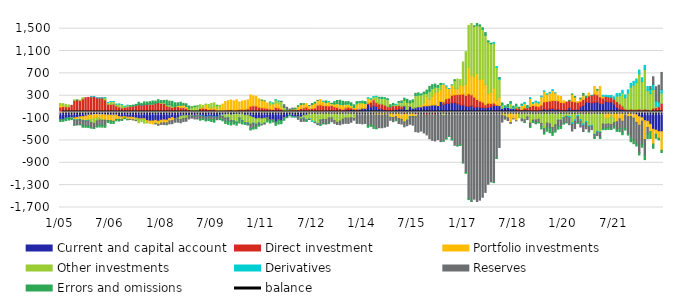
| Category | Current and capital account | Direct investment | Portfolio investments | Other investments | Derivatives | Reserves | Errors and omissions |
|---|---|---|---|---|---|---|---|
| 2005-01-01 | -124.441 | 95.969 | 39.087 | 26.806 | -3.065 | -5.26 | -29.096 |
| 2005-02-01 | -122.296 | 106.451 | 15.114 | 35.964 | -2.865 | -3.918 | -28.449 |
| 2005-03-01 | -100.116 | 102.116 | 6.391 | 36.628 | -2.888 | -3.167 | -38.963 |
| 2005-04-01 | -90.744 | 102.48 | 2.986 | 29.42 | -4.783 | -6.772 | -32.587 |
| 2005-05-01 | -89.679 | 128.07 | -3.823 | -2.079 | -5.604 | -5.721 | -21.164 |
| 2005-06-01 | -96.933 | 213.928 | -31.807 | 14.9 | -7.103 | -88.045 | -4.94 |
| 2005-07-01 | -88.549 | 221.495 | -40.71 | -0.842 | -6.275 | -86.563 | 1.444 |
| 2005-08-01 | -77.137 | 212.773 | -43.483 | 6.714 | -6.537 | -89.944 | -2.386 |
| 2005-09-01 | -73.567 | 242.95 | -64.269 | 20.836 | -5.857 | -90.117 | -29.976 |
| 2005-10-01 | -62.91 | 265.013 | -77.21 | -7.197 | -4.649 | -90.105 | -22.942 |
| 2005-11-01 | -48.904 | 269.98 | -71.257 | -26.77 | -3.361 | -92.488 | -27.198 |
| 2005-12-01 | -44.466 | 279.63 | -81.187 | -52.224 | 0.188 | -92.851 | -9.091 |
| 2006-01-01 | -35.444 | 286.612 | -77.386 | -82.044 | 0.334 | -88.37 | -3.702 |
| 2006-02-01 | -32.147 | 261.427 | -60.913 | -57.207 | 0.355 | -92.35 | -19.166 |
| 2006-03-01 | -36.206 | 259.906 | -66.476 | -31.709 | 0.352 | -90.272 | -35.595 |
| 2006-04-01 | -38.805 | 261.891 | -82.916 | -18.61 | 0.424 | -86.38 | -35.603 |
| 2006-05-01 | -42.031 | 226.242 | -94.803 | 38.443 | 0.405 | -87.108 | -41.149 |
| 2006-06-01 | -44.576 | 146.85 | -99.523 | 30.924 | 0.366 | -5.548 | -28.492 |
| 2006-07-01 | -48.513 | 145.409 | -99.489 | 49.973 | 0.44 | -6.593 | -41.226 |
| 2006-08-01 | -46.557 | 148.445 | -108.886 | 47.854 | 0.452 | -6.15 | -35.158 |
| 2006-09-01 | -45.66 | 119.059 | -76.938 | 29.42 | 0.458 | -5.379 | -20.96 |
| 2006-10-01 | -73.871 | 97.411 | -49.213 | 54.007 | 0.541 | -7.077 | -21.796 |
| 2006-11-01 | -78.121 | 82.298 | -45.066 | 59.653 | 0.578 | -4.684 | -14.658 |
| 2006-12-01 | -75.212 | 90.262 | -26.882 | 20.925 | 0.679 | -2.075 | -7.696 |
| 2007-01-01 | -83.423 | 101.253 | -38.198 | 27.914 | 0.347 | -6.558 | -1.335 |
| 2007-02-01 | -84.812 | 110.884 | -37.352 | 5.205 | 0.448 | -0.928 | 6.556 |
| 2007-03-01 | -87.759 | 119.2 | -42.444 | 2.9 | 0.651 | -2.222 | 9.675 |
| 2007-04-01 | -98.952 | 125.496 | -20.046 | -24.529 | 0.603 | -1.944 | 19.374 |
| 2007-05-01 | -115.181 | 140.267 | -0.424 | -67.889 | 0.571 | 3.145 | 39.512 |
| 2007-06-01 | -111.686 | 132.066 | -13.346 | -38.819 | 0.383 | 5.255 | 26.147 |
| 2007-07-01 | -110.629 | 139.899 | -17.679 | -62.691 | 0.819 | 5.975 | 44.306 |
| 2007-08-01 | -145.936 | 146.494 | -28.978 | -12.535 | 0.999 | 3.072 | 36.885 |
| 2007-09-01 | -153.084 | 142.552 | -41.157 | 10.856 | 1.127 | 2.524 | 37.18 |
| 2007-10-01 | -151.952 | 148.301 | -52.926 | 6.14 | 1.324 | 1.454 | 47.66 |
| 2007-11-01 | -140.913 | 169.558 | -46.7 | -12.052 | 1.439 | -4.989 | 33.657 |
| 2007-12-01 | -155.189 | 179.064 | -58.258 | 4.625 | 1.297 | -15.666 | 44.127 |
| 2008-01-01 | -139.155 | 162.969 | -50.423 | 13.634 | 1.767 | -23.652 | 34.859 |
| 2008-02-01 | -132.842 | 162.76 | -50.101 | 16.257 | 2.075 | -32.474 | 34.324 |
| 2008-03-01 | -137.494 | 118.698 | -47.643 | 19.909 | 1.501 | -34.244 | 79.272 |
| 2008-04-01 | -107.244 | 104.523 | -43.151 | 34.588 | 1.689 | -53.309 | 62.904 |
| 2008-05-01 | -89.527 | 91.732 | -53.819 | 26.557 | 1.924 | -56.774 | 79.906 |
| 2008-06-01 | -112.332 | 113.068 | -1.37 | 0.386 | 3.156 | -60.286 | 57.377 |
| 2008-07-01 | -98.433 | 104.608 | 24.023 | -16.001 | 2.504 | -59.112 | 42.41 |
| 2008-08-01 | -65.04 | 85.821 | 43.933 | -59.607 | 1.553 | -59.348 | 52.687 |
| 2008-09-01 | -58.791 | 87.331 | 47.4 | -47.509 | 1.636 | -56.478 | 26.412 |
| 2008-10-01 | -56.607 | 74.424 | 35.608 | -41.803 | 1.578 | -57.768 | 44.569 |
| 2008-11-01 | -61.103 | 53.223 | -7.622 | 24.032 | -0.127 | -47.052 | 38.648 |
| 2008-12-01 | -49.23 | 36.327 | -9.146 | 58.766 | -2.607 | -40.111 | 6.001 |
| 2009-01-01 | -65.644 | 34.981 | -6.533 | 68.796 | -3.869 | -39.448 | 11.717 |
| 2009-02-01 | -47.079 | 33.476 | -5.426 | 82.017 | -5.137 | -59.391 | 1.54 |
| 2009-03-01 | -57.657 | 76.496 | 2.846 | 59.438 | -4.729 | -56.897 | -19.497 |
| 2009-04-01 | -63.743 | 78.011 | 16.979 | 33.12 | -4.444 | -45.707 | -14.217 |
| 2009-05-01 | -77.985 | 71.53 | 69.517 | 9.818 | -5.037 | -50.088 | -17.755 |
| 2009-06-01 | -65.636 | 52.724 | 37.762 | 54.86 | -5.444 | -45.396 | -28.868 |
| 2009-07-01 | -70.456 | 56.607 | 23.473 | 81.424 | -5.5 | -50.881 | -34.667 |
| 2009-08-01 | -75.834 | 60.436 | 37.65 | 75.148 | -4.999 | -42.508 | -49.894 |
| 2009-09-01 | -80.317 | 19.168 | 53.25 | 56.442 | -5.31 | -43.295 | 0.062 |
| 2009-10-01 | -50.64 | 16.017 | 84.549 | 27.42 | -6.32 | -44.017 | -27.01 |
| 2009-11-01 | -43.565 | 25.287 | 124.379 | -23.687 | -3.981 | -52.899 | -25.534 |
| 2009-12-01 | -37.928 | 37.694 | 158.688 | -62.101 | -1.288 | -60.646 | -34.419 |
| 2010-01-01 | -23.312 | 44.096 | 167.271 | -72.935 | -0.918 | -57.35 | -56.851 |
| 2010-02-01 | -44.444 | 51.441 | 172.535 | -96.436 | -0.658 | -24.165 | -58.272 |
| 2010-03-01 | -35.774 | 35.109 | 173.365 | -113.51 | -1.262 | -17.66 | -40.267 |
| 2010-04-01 | -24.486 | 40.28 | 186.135 | -146.14 | -1.347 | -8.814 | -45.628 |
| 2010-05-01 | -27.913 | 54.679 | 132.614 | -71.933 | -0.566 | -11.516 | -75.366 |
| 2010-06-01 | -7.947 | 56.225 | 148.714 | -133.05 | -0.789 | -14.791 | -48.362 |
| 2010-07-01 | -50.09 | 56.216 | 156.042 | -133.579 | -0.924 | -14.636 | -13.028 |
| 2010-08-01 | -47.156 | 67.767 | 158.203 | -138.067 | -1.091 | -27.99 | -11.666 |
| 2010-09-01 | -69.148 | 111 | 202.812 | -139.799 | -1.329 | -77.548 | -25.988 |
| 2010-10-01 | -89.776 | 119.635 | 177.882 | -101.974 | -1.563 | -68.884 | -35.32 |
| 2010-11-01 | -113.162 | 117.523 | 172.315 | -95.285 | -3.495 | -47.139 | -30.757 |
| 2010-12-01 | -104.18 | 94.99 | 150.353 | -76.832 | -4.748 | -41.425 | -18.159 |
| 2011-01-01 | -112.249 | 85.701 | 136.06 | -100.04 | -3.121 | -7.374 | 1.021 |
| 2011-02-01 | -102.287 | 80.335 | 127.736 | -86.588 | -1.586 | -18.566 | 0.957 |
| 2011-03-01 | -97.652 | 72.662 | 96.809 | -11.906 | -0.433 | -21.448 | -38.032 |
| 2011-04-01 | -124.856 | 61.899 | 72.974 | 51.933 | 1.134 | -23.294 | -39.792 |
| 2011-05-01 | -124.383 | 56.516 | 92.859 | 18.459 | 2.241 | -18.176 | -27.516 |
| 2011-06-01 | -164.887 | 90.626 | 76.627 | 58.552 | 4 | -20.423 | -44.494 |
| 2011-07-01 | -127.374 | 81.742 | 69.82 | 52.031 | 3.104 | -16.155 | -63.168 |
| 2011-08-01 | -144.867 | 61.807 | 42.247 | 93.574 | 1.908 | 0.029 | -54.698 |
| 2011-09-01 | -98.512 | 17.782 | -3.278 | 73.351 | 2.511 | 45.365 | -37.218 |
| 2011-10-01 | -81.308 | 12.681 | 0.923 | 40.645 | 2.323 | 36.939 | -12.202 |
| 2011-11-01 | -48.288 | 11.716 | 9.042 | 29.031 | -0.428 | 12.876 | -13.948 |
| 2011-12-01 | -72.091 | 46.805 | 5.781 | 8.622 | -3.673 | 17.23 | -2.673 |
| 2012-01-01 | -71.765 | 49.424 | 10.666 | 6.27 | -4.179 | -2.599 | 12.183 |
| 2012-02-01 | -79.424 | 50.592 | 59.164 | -10.81 | -1.836 | -30.201 | 12.516 |
| 2012-03-01 | -82.403 | 71.489 | 70.983 | -33.775 | -1.37 | -42.191 | 17.268 |
| 2012-04-01 | -55.856 | 83.434 | 66.434 | -42.772 | -3.649 | -55.377 | 7.786 |
| 2012-05-01 | -47.814 | 97.272 | 62.13 | -80.113 | -5.98 | -11.629 | -13.865 |
| 2012-06-01 | -4.534 | 68.001 | 56.551 | -107.547 | -9.458 | -4.086 | 1.074 |
| 2012-07-01 | -9.854 | 74.813 | 69.95 | -142.421 | -8.184 | 0.337 | 15.359 |
| 2012-08-01 | -2.597 | 81.568 | 85.993 | -168.212 | -6.378 | -6.409 | 16.036 |
| 2012-09-01 | -22.78 | 129.537 | 86.466 | -175.565 | -3.162 | -16.106 | 1.609 |
| 2012-10-01 | -1.424 | 136.501 | 94.815 | -133.195 | -0.024 | -82.175 | -14.498 |
| 2012-11-01 | -2.02 | 123.145 | 76.137 | -120.867 | 5.046 | -75.302 | -6.139 |
| 2012-12-01 | -10.302 | 121.261 | 54.848 | -115.942 | 8.618 | -80.474 | 21.991 |
| 2013-01-01 | -7.036 | 117.217 | 73.375 | -90.463 | 7.59 | -98.023 | -2.66 |
| 2013-02-01 | 13.966 | 112.128 | 32.087 | -96.088 | 4.273 | -69.024 | 2.658 |
| 2013-03-01 | -19.176 | 103.112 | 48.504 | -123.155 | 3.833 | -53.451 | 40.333 |
| 2013-04-01 | -22.668 | 92.047 | 70.258 | -153.123 | 4.515 | -39.026 | 47.997 |
| 2013-05-01 | -16.681 | 72.891 | 73.219 | -135.312 | 5.105 | -66.757 | 67.535 |
| 2013-06-01 | -14.434 | 56.612 | 80.987 | -104.838 | 7.726 | -82.522 | 56.469 |
| 2013-07-01 | 35.854 | 46.634 | 64.673 | -98.53 | 8.072 | -94.98 | 38.278 |
| 2013-08-01 | 51.942 | 44.252 | 54.412 | -101.583 | 8.101 | -94.924 | 37.8 |
| 2013-09-01 | 54.846 | 28.419 | 45.777 | -93.732 | 4.982 | -81.09 | 40.799 |
| 2013-10-01 | 48.645 | 15.299 | 26.09 | -107.167 | 4.064 | -30.204 | 43.272 |
| 2013-11-01 | 38.337 | 24.98 | 69.132 | 34.434 | 4.568 | -194.429 | 22.979 |
| 2013-12-01 | 60.652 | -7.438 | 92.838 | 29.747 | 4.737 | -188.191 | 7.655 |
| 2014-01-01 | 76.1 | -2.601 | 81.912 | 20.15 | 5.741 | -201.152 | 19.85 |
| 2014-02-01 | 70.566 | 5.975 | 83.668 | -2.356 | 6.611 | -193.752 | 29.287 |
| 2014-03-01 | 146.772 | 19.795 | 90.883 | -28.1 | 7.415 | -207.661 | -29.104 |
| 2014-04-01 | 97.569 | 89.191 | 38.21 | 15.421 | 7.724 | -221.599 | -26.516 |
| 2014-05-01 | 119.193 | 106.431 | 13.494 | 36.557 | 9.334 | -241.224 | -43.785 |
| 2014-06-01 | 110.206 | 67.369 | -37.704 | 107.195 | 6.478 | -247.349 | -6.196 |
| 2014-07-01 | 69.905 | 83.516 | -42.952 | 105.013 | 7.26 | -228.89 | 6.148 |
| 2014-08-01 | 61.301 | 89.081 | -46.649 | 98.871 | 7.601 | -226.61 | 16.406 |
| 2014-09-01 | 46.655 | 85.578 | -37.27 | 122.533 | 6.234 | -226.012 | 2.282 |
| 2014-10-01 | 30.752 | 74.779 | -35.586 | 125.857 | 5.434 | -211.155 | 9.917 |
| 2014-11-01 | 27.426 | 72.24 | -72.459 | -18.945 | 5.718 | -48.365 | 34.384 |
| 2014-12-01 | 40.201 | 80.383 | -90.269 | 13.368 | 6.046 | -73.123 | 23.393 |
| 2015-01-01 | 47.082 | 74.671 | -74.057 | 22.379 | 4.146 | -63.062 | -11.16 |
| 2015-02-01 | 64.438 | 63.07 | -107.527 | 58.027 | 3.488 | -90.114 | 8.619 |
| 2015-03-01 | 61.952 | 51.724 | -121.058 | 67.394 | 3.868 | -86.053 | 22.173 |
| 2015-04-01 | 117.258 | -33.411 | -136.96 | 101.367 | -1.045 | -84.552 | 37.342 |
| 2015-05-01 | 53.636 | -19.357 | -115.596 | 125.992 | -3.562 | -97.71 | 56.598 |
| 2015-06-01 | 105.409 | 7.387 | -74.673 | 59.418 | -1.026 | -134.52 | 38.005 |
| 2015-07-01 | 75.564 | -6.34 | -63.275 | 112.555 | -0.381 | -156.35 | 38.228 |
| 2015-08-01 | 86.554 | -32.895 | -37.812 | 220.111 | 0.717 | -272.248 | 35.573 |
| 2015-09-01 | 102.7 | -29.202 | 12.744 | 197.463 | 2.751 | -322.407 | 35.952 |
| 2015-10-01 | 100.512 | -18.347 | 30.053 | 184.876 | 3.704 | -313.861 | 13.064 |
| 2015-11-01 | 118.662 | -29.192 | 52.499 | 165.57 | 3.6 | -335.954 | 24.815 |
| 2015-12-01 | 119.739 | -49.748 | 164.135 | 58.735 | 4.77 | -351.305 | 53.675 |
| 2016-01-01 | 122.887 | -34.31 | 113.027 | 143.52 | 4.631 | -435.132 | 85.377 |
| 2016-02-01 | 133.482 | -32.742 | 156.301 | 141.674 | 3.924 | -465.391 | 62.751 |
| 2016-03-01 | 134.43 | -44.685 | 222.581 | 100.03 | 2.611 | -464.178 | 49.212 |
| 2016-04-01 | 120.546 | 4.787 | 244.565 | 80.345 | 6.325 | -484.676 | 28.108 |
| 2016-05-01 | 196.511 | -9.794 | 213.088 | 89.1 | 8.54 | -511.484 | 14.039 |
| 2016-06-01 | 140.692 | 49.487 | 317.438 | -56.509 | 6.54 | -452.936 | -4.712 |
| 2016-07-01 | 164.713 | 80.816 | 191.091 | 36.528 | 3.289 | -467.712 | -8.724 |
| 2016-08-01 | 163.423 | 93.491 | 171.964 | -12.524 | 0.488 | -414.993 | -1.85 |
| 2016-09-01 | 175.37 | 132.72 | 185.989 | -27.218 | 0.66 | -448.286 | -19.235 |
| 2016-10-01 | 180.263 | 136.956 | 113.705 | 140.399 | -0.733 | -586.443 | 15.854 |
| 2016-11-01 | 156.2 | 164.45 | 104.413 | 172.532 | -5.672 | -590.37 | -1.556 |
| 2016-12-01 | 136.832 | 186.549 | 169.532 | 96.615 | -11.291 | -563.521 | -14.716 |
| 2017-01-01 | 133.425 | 196.835 | 149.766 | 423.862 | -10.034 | -888.493 | -5.362 |
| 2017-02-01 | 115.392 | 192.45 | 194.217 | 586.242 | -11.159 | -1057.888 | -19.254 |
| 2017-03-01 | 107.276 | 225.107 | 478.723 | 748.319 | -11.446 | -1531.838 | -16.141 |
| 2017-04-01 | 121.608 | 193.727 | 352.524 | 924.831 | -11.77 | -1576.287 | -4.634 |
| 2017-05-01 | 97.526 | 178.028 | 359.538 | 905.362 | -7.82 | -1542.877 | 10.244 |
| 2017-06-01 | 98.913 | 133.395 | 464.482 | 861.543 | -6.072 | -1585.697 | 33.436 |
| 2017-07-01 | 91.96 | 114.079 | 387.829 | 950.666 | -1.827 | -1566.632 | 23.926 |
| 2017-08-01 | 88.999 | 95.116 | 416.824 | 887.727 | 3.503 | -1516.587 | 24.418 |
| 2017-09-01 | 80.144 | 60.1 | 362.621 | 880.447 | 1.883 | -1430.312 | 45.119 |
| 2017-10-01 | 92.476 | 74.539 | 165.793 | 932.479 | 1.516 | -1283.1 | 16.298 |
| 2017-11-01 | 100.507 | 62.307 | 198.477 | 867.092 | 6.534 | -1241.542 | 6.624 |
| 2017-12-01 | 124.017 | 45.857 | 268.263 | 802.453 | 14.19 | -1246.408 | -8.371 |
| 2018-01-01 | 127.634 | 6.897 | 85.198 | 586.914 | 15.506 | -816.481 | -5.669 |
| 2018-02-01 | 123.485 | -0.877 | 147.701 | 324.218 | 15.373 | -625.514 | 15.613 |
| 2018-03-01 | 73.836 | -12.224 | -35.723 | 56.884 | 14.998 | -123.043 | 25.27 |
| 2018-04-01 | 92.288 | -0.562 | -38.958 | -28.145 | 16.822 | -51.766 | 10.32 |
| 2018-05-01 | 91.283 | -0.015 | -95.024 | 3.631 | 14.49 | -48.998 | 34.633 |
| 2018-06-01 | 72.298 | 0.24 | -178.211 | 88.918 | 15.957 | -16.922 | 17.72 |
| 2018-07-01 | 72.65 | -2.901 | -109.351 | 8.241 | 13.683 | -1.887 | 19.565 |
| 2018-08-01 | 50.358 | 32.246 | -147.69 | 32.085 | 9.846 | -1.175 | 24.33 |
| 2018-09-01 | 40.95 | 37.543 | -25.179 | -68.693 | 9.468 | 2.892 | 3.018 |
| 2018-10-01 | 39.403 | 14.804 | 72.598 | -115.001 | 18.734 | -34.264 | 3.725 |
| 2018-11-01 | 51.333 | 33.354 | 74.852 | -129.911 | 20.707 | -47.993 | -2.342 |
| 2018-12-01 | 36.76 | 51.018 | -30.144 | -46.972 | 15.291 | -49.965 | 24.012 |
| 2019-01-01 | 31.57 | 75.792 | 142.991 | -189.865 | 16.341 | -57.395 | -19.434 |
| 2019-02-01 | 23.05 | 102.106 | 37.176 | -136.082 | 17.864 | -21.852 | -22.263 |
| 2019-03-01 | 24.522 | 92.305 | 68.003 | -134.07 | 17.873 | -53.612 | -15.022 |
| 2019-04-01 | 24.091 | 79.172 | 66.605 | -120.988 | 17.703 | -56.717 | -9.865 |
| 2019-05-01 | 40.757 | 91.071 | 148.036 | -195.892 | 15.443 | -55.871 | -43.544 |
| 2019-06-01 | 66.681 | 123.657 | 187.583 | -289.165 | 9.393 | -65.523 | -32.626 |
| 2019-07-01 | 50.102 | 147.67 | 127.163 | -187.977 | 9.416 | -82.791 | -63.584 |
| 2019-08-01 | 64.491 | 140.363 | 143.857 | -202.585 | 13.325 | -75.336 | -84.115 |
| 2019-09-01 | 72.03 | 142.336 | 180.599 | -268.704 | 14.68 | -93.118 | -47.822 |
| 2019-10-01 | 50.235 | 163.184 | 136.493 | -219.14 | 2.324 | -96.161 | -36.933 |
| 2019-11-01 | 60.867 | 147.339 | 90.165 | -135.905 | -2.587 | -111.748 | -48.129 |
| 2019-12-01 | 43.648 | 137.141 | 104.656 | -138.924 | -1.041 | -110.22 | -35.26 |
| 2020-01-01 | 30.944 | 143.12 | 35.897 | -89.592 | -7.146 | -98.813 | -14.409 |
| 2020-02-01 | 42.539 | 144.612 | -17.291 | -45.318 | -8.596 | -105.195 | -10.751 |
| 2020-03-01 | 84.8 | 126.071 | -1.306 | -70.484 | -24.849 | -121.242 | 7.011 |
| 2020-04-01 | 53.26 | 147.501 | 124.484 | -183.424 | -26.494 | -121.48 | 6.153 |
| 2020-05-01 | 49.414 | 142.47 | 83.546 | -129.384 | -28.165 | -130.596 | 12.715 |
| 2020-06-01 | 49.58 | 131.712 | 12.658 | -49.672 | -25.934 | -108.635 | -9.71 |
| 2020-07-01 | 99.522 | 98.381 | 45.495 | -124.877 | -29.591 | -105.268 | 16.338 |
| 2020-08-01 | 125.087 | 108.194 | 73.904 | -201.677 | -32.196 | -106.877 | 33.565 |
| 2020-09-01 | 185.846 | 83.831 | -33.084 | -126.343 | -23.943 | -107.331 | 21.024 |
| 2020-10-01 | 180.5 | 117.668 | 48.709 | -236.846 | -16.605 | -89.964 | -3.462 |
| 2020-11-01 | 174.305 | 129.558 | -24.34 | -205.834 | -13.97 | -62.27 | 2.552 |
| 2020-12-01 | 180.467 | 149.051 | 135.675 | -389.428 | -10.796 | -47.814 | -17.155 |
| 2021-01-01 | 186.304 | 130.078 | 85.63 | -334.945 | -16.516 | -62.761 | 12.21 |
| 2021-02-01 | 163.114 | 117.327 | 183.907 | -347.704 | -11.264 | -91.619 | -13.762 |
| 2021-03-01 | 156.728 | 102.73 | 33.392 | -205.248 | 13.582 | -85.987 | -15.196 |
| 2021-04-01 | 196.959 | 88.918 | -115.922 | -96.296 | 21.354 | -68.905 | -26.108 |
| 2021-05-01 | 185.811 | 91.655 | -103.267 | -101.399 | 26.058 | -58.469 | -40.389 |
| 2021-06-01 | 190.775 | 81.088 | -57.793 | -157.23 | 32.921 | -76.268 | -13.495 |
| 2021-07-01 | 151.111 | 88.977 | -108.996 | -72.004 | 41.657 | -71.329 | -29.417 |
| 2021-08-01 | 94.119 | 101.751 | -164.121 | 97.965 | 43.849 | -147.657 | -25.905 |
| 2021-09-01 | 57.501 | 94.588 | -112.111 | 150.417 | 39.608 | -173.463 | -56.54 |
| 2021-10-01 | 54.337 | 58.142 | -155.037 | 237.971 | 46.781 | -205.387 | -36.806 |
| 2021-11-01 | 31.178 | 31.355 | -42.087 | 200.734 | 51.508 | -239.511 | -33.179 |
| 2021-12-01 | 43.98 | 4.842 | -75.189 | 297.438 | 58.047 | -296.053 | -33.064 |
| 2022-01-01 | 27.14 | 34.18 | -67.861 | 392.004 | 69.233 | -381.055 | -73.641 |
| 2022-02-01 | 7.77 | 44.594 | -102.18 | 435.774 | 69.678 | -393.021 | -62.615 |
| 2022-03-01 | -39.662 | 54.686 | -136.897 | 479.819 | 65.198 | -385.999 | -37.145 |
| 2022-04-01 | -75.42 | 61.621 | -152.207 | 631.097 | 66.118 | -490.719 | -40.489 |
| 2022-05-01 | -95.06 | 51.63 | -59.926 | 498.812 | 70.59 | -411.86 | -54.185 |
| 2022-06-01 | -146.401 | 61.74 | -337.415 | 705.852 | 74.958 | -283.153 | -75.581 |
| 2022-07-01 | -157.477 | 54.237 | -110.27 | 336.124 | 75.765 | -116.117 | -82.262 |
| 2022-08-01 | -210.698 | 29.026 | -131.474 | 309.519 | 75.669 | 50.002 | -122.044 |
| 2022-09-01 | -300.341 | 77.87 | -264.506 | 332.922 | 91.69 | 137.07 | -74.705 |
| 2022-10-01 | -316.904 | 88.706 | -70.424 | 25.254 | 92.724 | 254.301 | -73.656 |
| 2022-11-01 | -342.817 | 102.704 | -117.191 | -3.303 | 86.327 | 299.884 | -25.604 |
| 2022-12-01 | -343.543 | 161.745 | -332.951 | 188.187 | 59.897 | 307.149 | -40.483 |